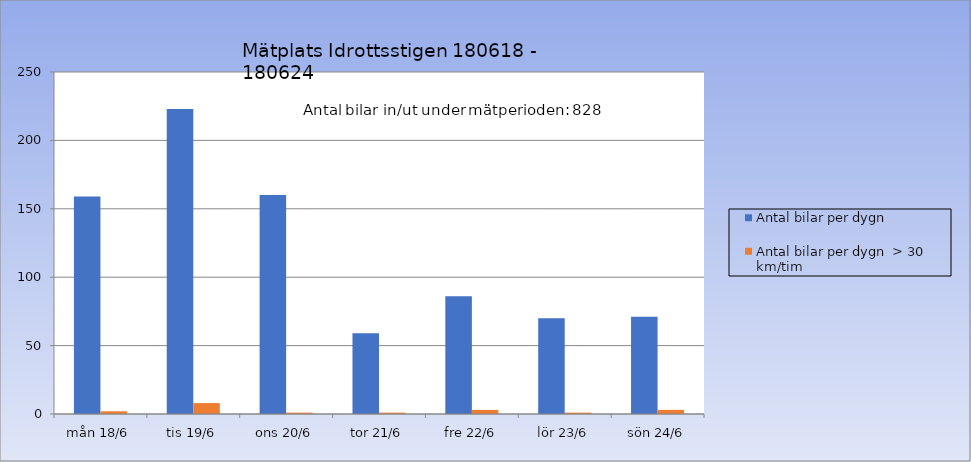
| Category | Antal bilar per dygn | Antal bilar per dygn  > 30 km/tim |
|---|---|---|
| mån 18/6 | 159 | 2 |
| tis 19/6 | 223 | 8 |
| ons 20/6 | 160 | 1 |
| tor 21/6 | 59 | 1 |
| fre 22/6 | 86 | 3 |
| lör 23/6 | 70 | 1 |
| sön 24/6 | 71 | 3 |